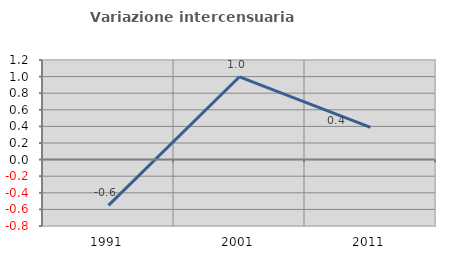
| Category | Variazione intercensuaria annua |
|---|---|
| 1991.0 | -0.552 |
| 2001.0 | 0.998 |
| 2011.0 | 0.388 |